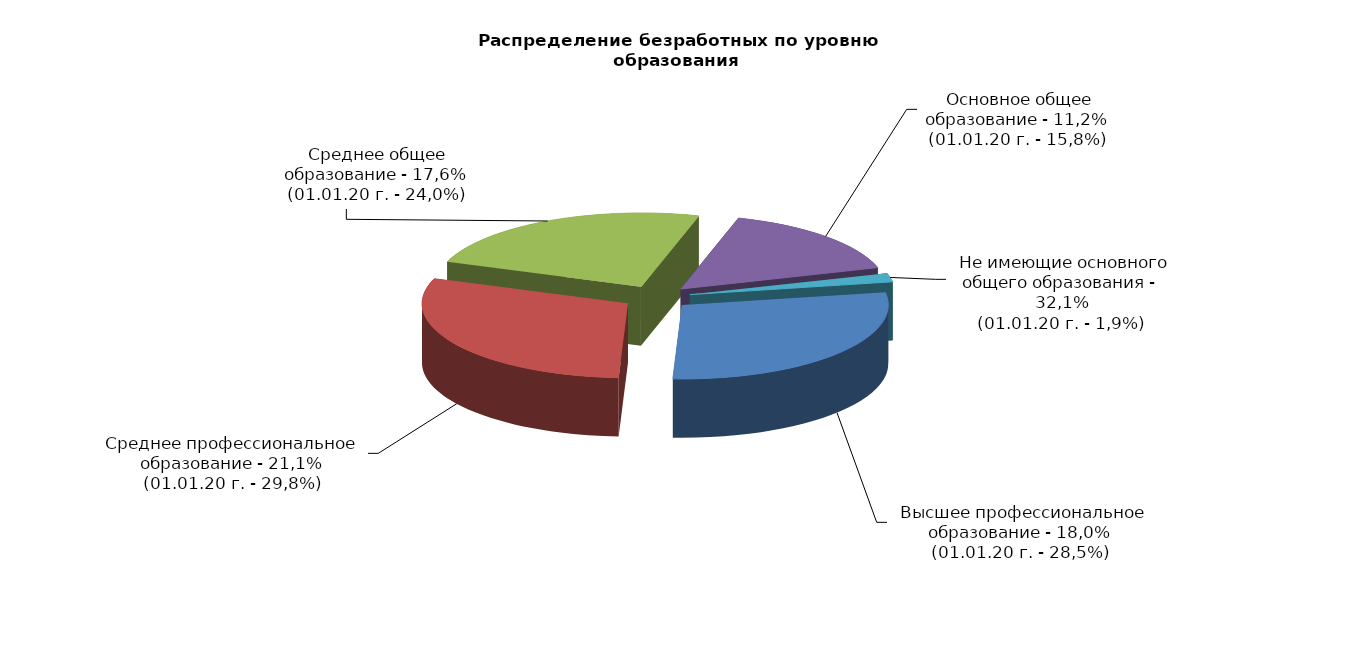
| Category | Series 0 | Series 1 |
|---|---|---|
|  - высшее профессиональное образование | 28.5 | 18 |
|  - среднее профессиональное образование | 29.8 | 21.1 |
|  - среднее общее образование | 24 | 17.6 |
|  - основное общее образование | 15.8 | 11.2 |
|  - не имеющие основного общего образования | 1.9 | 32.1 |